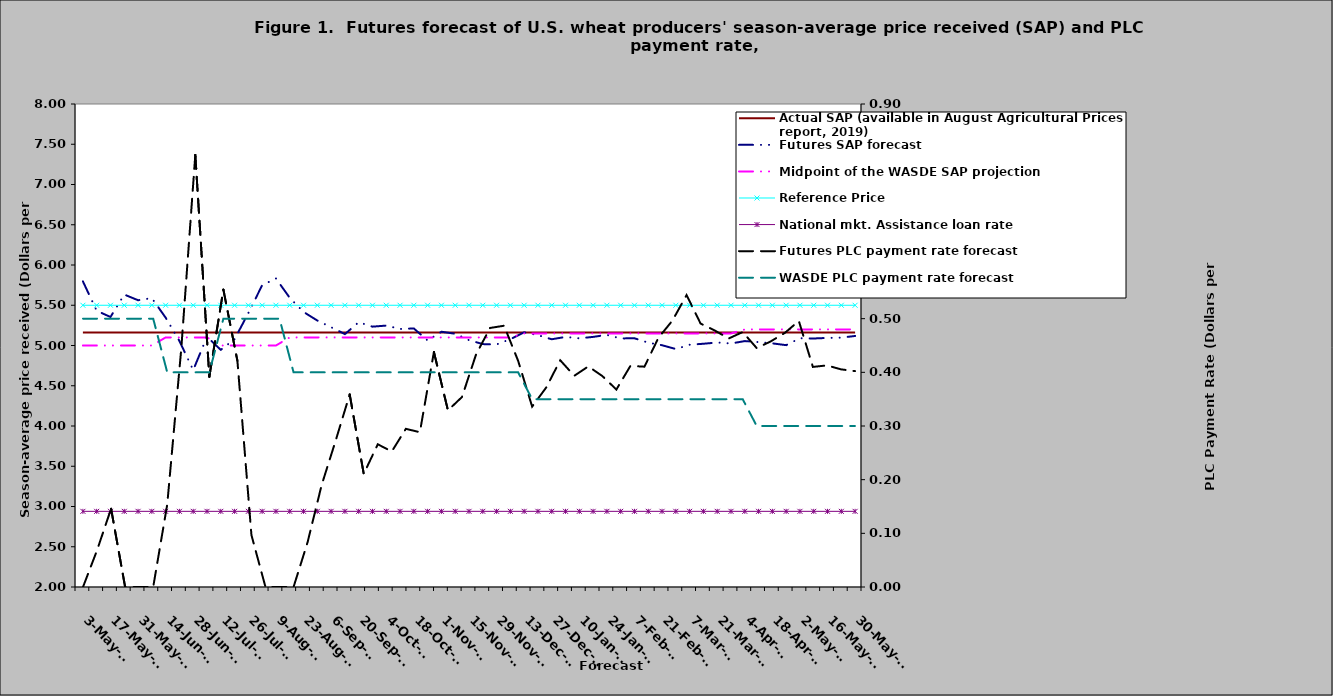
| Category | Actual SAP (available in August Agricultural Prices report, 2019) | Futures SAP forecast | Midpoint of the WASDE SAP projection | Reference Price | National mkt. Assistance loan rate |
|---|---|---|---|---|---|
| 2018-05-03 | 5.16 | 5.797 | 5 | 5.5 | 2.94 |
| 2018-05-10 | 5.16 | 5.432 | 5 | 5.5 | 2.94 |
| 2018-05-17 | 5.16 | 5.354 | 5 | 5.5 | 2.94 |
| 2018-05-24 | 5.16 | 5.633 | 5 | 5.5 | 2.94 |
| 2018-05-31 | 5.16 | 5.562 | 5 | 5.5 | 2.94 |
| 2018-06-07 | 5.16 | 5.588 | 5 | 5.5 | 2.94 |
| 2018-06-14 | 5.16 | 5.346 | 5.1 | 5.5 | 2.94 |
| 2018-06-21 | 5.16 | 5.056 | 5.1 | 5.5 | 2.94 |
| 2018-06-28 | 5.16 | 4.695 | 5.1 | 5.5 | 2.94 |
| 2018-07-05 | 5.16 | 5.108 | 5.1 | 5.5 | 2.94 |
| 2018-07-12 | 5.16 | 4.946 | 5 | 5.5 | 2.94 |
| 2018-07-19 | 5.16 | 5.079 | 5 | 5.5 | 2.94 |
| 2018-07-26 | 5.16 | 5.403 | 5 | 5.5 | 2.94 |
| 2018-08-02 | 5.16 | 5.748 | 5 | 5.5 | 2.94 |
| 2018-08-09 | 5.16 | 5.832 | 5 | 5.5 | 2.94 |
| 2018-08-16 | 5.16 | 5.593 | 5.1 | 5.5 | 2.94 |
| 2018-08-23 | 5.16 | 5.417 | 5.1 | 5.5 | 2.94 |
| 2018-08-30 | 5.16 | 5.31 | 5.1 | 5.5 | 2.94 |
| 2018-09-06 | 5.16 | 5.227 | 5.1 | 5.5 | 2.94 |
| 2018-09-13 | 5.16 | 5.141 | 5.1 | 5.5 | 2.94 |
| 2018-09-20 | 5.16 | 5.289 | 5.1 | 5.5 | 2.94 |
| 2018-09-27 | 5.16 | 5.234 | 5.1 | 5.5 | 2.94 |
| 2018-10-04 | 5.16 | 5.247 | 5.1 | 5.5 | 2.94 |
| 2018-10-11 | 5.16 | 5.205 | 5.1 | 5.5 | 2.94 |
| 2018-10-18 | 5.16 | 5.212 | 5.1 | 5.5 | 2.94 |
| 2018-10-25 | 5.16 | 5.062 | 5.1 | 5.5 | 2.94 |
| 2018-11-01 | 5.16 | 5.171 | 5.1 | 5.5 | 2.94 |
| 2018-11-08 | 5.16 | 5.146 | 5.1 | 5.5 | 2.94 |
| 2018-11-15 | 5.16 | 5.067 | 5.1 | 5.5 | 2.94 |
| 2018-11-22 | 5.16 | 5.017 | 5.1 | 5.5 | 2.94 |
| 2018-11-29 | 5.16 | 5.013 | 5.1 | 5.5 | 2.94 |
| 2018-12-06 | 5.16 | 5.079 | 5.1 | 5.5 | 2.94 |
| 2018-12-13 | 5.16 | 5.164 | 5.15 | 5.5 | 2.94 |
| 2018-12-20 | 5.16 | 5.128 | 5.15 | 5.5 | 2.94 |
| 2018-12-27 | 5.16 | 5.078 | 5.15 | 5.5 | 2.94 |
| 2019-01-03 | 5.16 | 5.106 | 5.15 | 5.5 | 2.94 |
| 2019-01-10 | 5.16 | 5.089 | 5.15 | 5.5 | 2.94 |
| 2019-01-17 | 5.16 | 5.107 | 5.15 | 5.5 | 2.94 |
| 2019-01-24 | 5.16 | 5.132 | 5.15 | 5.5 | 2.94 |
| 2019-01-31 | 5.16 | 5.088 | 5.15 | 5.5 | 2.94 |
| 2019-02-07 | 5.16 | 5.089 | 5.15 | 5.5 | 2.94 |
| 2019-02-14 | 5.16 | 5.036 | 5.15 | 5.5 | 2.94 |
| 2019-02-21 | 5.16 | 5.003 | 5.15 | 5.5 | 2.94 |
| 2019-02-28 | 5.16 | 4.956 | 5.15 | 5.5 | 2.94 |
| 2019-03-07 | 5.16 | 5.009 | 5.15 | 5.5 | 2.94 |
| 2019-03-14 | 5.16 | 5.022 | 5.15 | 5.5 | 2.94 |
| 2019-03-21 | 5.16 | 5.037 | 5.15 | 5.5 | 2.94 |
| 2019-03-28 | 5.16 | 5.025 | 5.15 | 5.5 | 2.94 |
| 2019-04-04 | 5.16 | 5.055 | 5.2 | 5.5 | 2.94 |
| 2019-04-11 | 5.16 | 5.042 | 5.2 | 5.5 | 2.94 |
| 2019-04-18 | 5.16 | 5.027 | 5.2 | 5.5 | 2.94 |
| 2019-04-25 | 5.16 | 5.004 | 5.2 | 5.5 | 2.94 |
| 2019-05-02 | 5.16 | 5.09 | 5.2 | 5.5 | 2.94 |
| 2019-05-09 | 5.16 | 5.087 | 5.2 | 5.5 | 2.94 |
| 2019-05-16 | 5.16 | 5.094 | 5.2 | 5.5 | 2.94 |
| 2019-05-23 | 5.16 | 5.098 | 5.2 | 5.5 | 2.94 |
| 2019-05-30 | 5.16 | 5.118 | 5.2 | 5.5 | 2.94 |